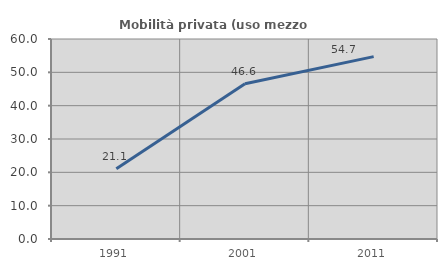
| Category | Mobilità privata (uso mezzo privato) |
|---|---|
| 1991.0 | 21.071 |
| 2001.0 | 46.554 |
| 2011.0 | 54.707 |